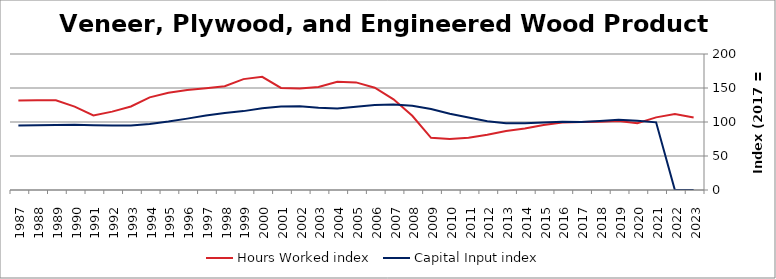
| Category | Hours Worked index | Capital Input index |
|---|---|---|
| 2023.0 | 106.528 | 0 |
| 2022.0 | 111.812 | 0 |
| 2021.0 | 106.778 | 99.478 |
| 2020.0 | 98.148 | 101.719 |
| 2019.0 | 101.325 | 103.209 |
| 2018.0 | 100.398 | 101.3 |
| 2017.0 | 100 | 100 |
| 2016.0 | 99.108 | 100.227 |
| 2015.0 | 95.62 | 99.265 |
| 2014.0 | 90.378 | 98.181 |
| 2013.0 | 86.659 | 98.16 |
| 2012.0 | 81.217 | 101.217 |
| 2011.0 | 76.725 | 106.683 |
| 2010.0 | 74.975 | 112.064 |
| 2009.0 | 76.707 | 119.086 |
| 2008.0 | 109.126 | 123.999 |
| 2007.0 | 133.326 | 125.557 |
| 2006.0 | 150.351 | 124.841 |
| 2005.0 | 158.269 | 122.535 |
| 2004.0 | 159.283 | 119.772 |
| 2003.0 | 151.426 | 121.039 |
| 2002.0 | 149.229 | 123.173 |
| 2001.0 | 150.12 | 122.618 |
| 2000.0 | 166.446 | 120.371 |
| 1999.0 | 163.063 | 116.008 |
| 1998.0 | 152.581 | 113.125 |
| 1997.0 | 149.52 | 109.413 |
| 1996.0 | 147.004 | 104.957 |
| 1995.0 | 142.904 | 100.68 |
| 1994.0 | 136.264 | 97.139 |
| 1993.0 | 122.81 | 94.976 |
| 1992.0 | 115.24 | 94.733 |
| 1991.0 | 109.624 | 95.285 |
| 1990.0 | 122.602 | 95.974 |
| 1989.0 | 131.955 | 95.599 |
| 1988.0 | 132.034 | 95.32 |
| 1987.0 | 131.621 | 94.734 |